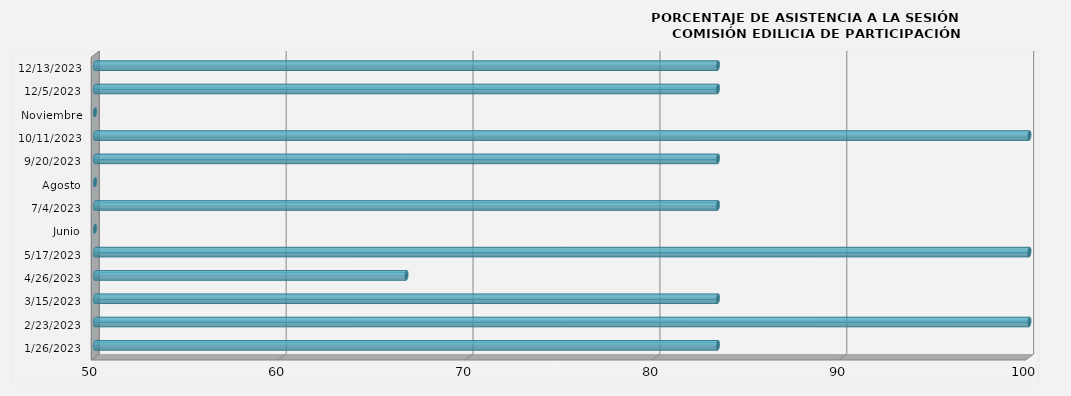
| Category | 1/26/2023 |
|---|---|
| 1/26/2023 | 83.333 |
| 2/23/2023 | 100 |
| 3/15/2023 | 83.333 |
| 4/26/2023 | 66.667 |
| 5/17/2023 | 100 |
| Junio | 0 |
| 7/4/2023 | 83.333 |
| Agosto | 0 |
| 9/20/2023 | 83.333 |
| 10/11/2023 | 100 |
| Noviembre | 0 |
| 12/5/2023 | 83.333 |
| 12/13/2023 | 83.333 |